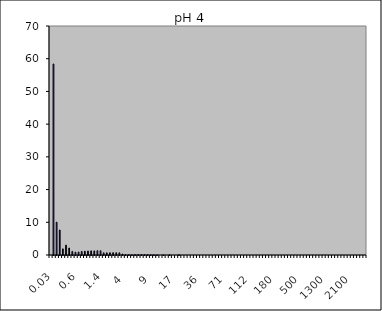
| Category | AH pH 4 2Nb |
|---|---|
| 0.03 | 0 |
| 0.04 | 58.388 |
| 0.07 | 10.038 |
| 0.1 | 7.629 |
| 0.2 | 1.871 |
| 0.3 | 3.012 |
| 0.4 | 2.133 |
| 0.5 | 1.111 |
| 0.6 | 0.862 |
| 0.7 | 0.902 |
| 0.8 | 1.087 |
| 0.9 | 1.155 |
| 1.0 | 1.205 |
| 1.1 | 1.269 |
| 1.2 | 1.251 |
| 1.3 | 1.322 |
| 1.4 | 1.305 |
| 1.6 | 0.657 |
| 1.8 | 0.667 |
| 2.0 | 0.689 |
| 2.2 | 0.698 |
| 2.4 | 0.695 |
| 2.6 | 0.68 |
| 3.0 | 0.296 |
| 4.0 | 0.095 |
| 5.0 | 0.081 |
| 6.0 | 0.066 |
| 6.5 | 0.113 |
| 7.0 | 0.122 |
| 7.5 | 0.131 |
| 8.0 | 0.094 |
| 8.5 | 0.1 |
| 9.0 | 0.053 |
| 10.0 | 0.057 |
| 11.0 | 0.032 |
| 12.0 | 0 |
| 13.0 | 0.038 |
| 14.0 | 0 |
| 15.0 | 0.044 |
| 16.0 | 0 |
| 17.0 | 0 |
| 18.0 | 0.053 |
| 19.0 | 0 |
| 20.0 | 0 |
| 22.0 | 0 |
| 25.0 | 0 |
| 28.0 | 0 |
| 32.0 | 0 |
| 36.0 | 0 |
| 38.0 | 0 |
| 40.0 | 0 |
| 45.0 | 0 |
| 50.0 | 0 |
| 53.0 | 0 |
| 56.0 | 0 |
| 63.0 | 0 |
| 71.0 | 0 |
| 75.0 | 0 |
| 80.0 | 0 |
| 85.0 | 0 |
| 90.0 | 0 |
| 95.0 | 0 |
| 100.0 | 0 |
| 106.0 | 0 |
| 112.0 | 0 |
| 125.0 | 0 |
| 130.0 | 0 |
| 140.0 | 0 |
| 145.0 | 0 |
| 150.0 | 0 |
| 160.0 | 0 |
| 170.0 | 0 |
| 180.0 | 0 |
| 190.0 | 0 |
| 200.0 | 0 |
| 212.0 | 0 |
| 242.0 | 0 |
| 250.0 | 0 |
| 300.0 | 0 |
| 400.0 | 0 |
| 500.0 | 0 |
| 600.0 | 0 |
| 700.0 | 0 |
| 800.0 | 0 |
| 900.0 | 0 |
| 1000.0 | 0 |
| 1100.0 | 0 |
| 1200.0 | 0 |
| 1300.0 | 0 |
| 1400.0 | 0 |
| 1500.0 | 0 |
| 1600.0 | 0 |
| 1700.0 | 0 |
| 1800.0 | 0 |
| 1900.0 | 0 |
| 2000.0 | 0 |
| 2100.0 | 0 |
| 2200.0 | 0 |
| 2300.0 | 0 |
| 2400.0 | 0 |
| 2500.0 | 0 |